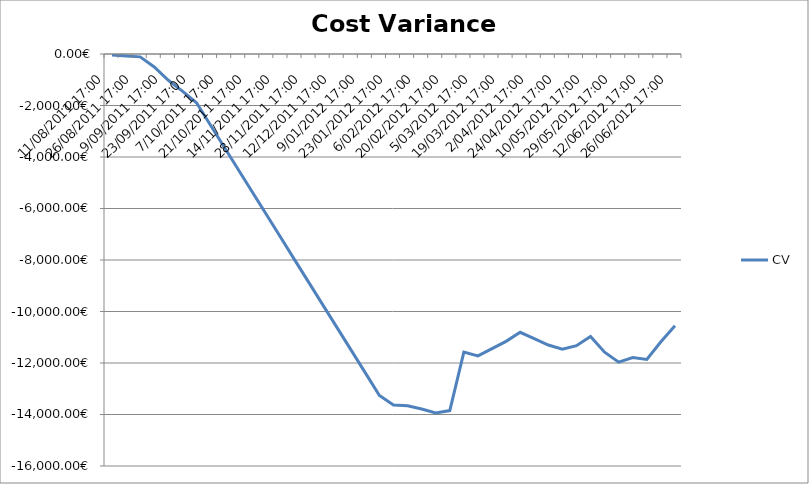
| Category | CV |
|---|---|
| 11/08/2011 17:00 | -36.951 |
| 19/08/2011 17:00 | -73.902 |
| 26/08/2011 17:00 | -110.853 |
| 2/09/2011 17:00 | -505.496 |
| 9/09/2011 17:00 | -1019.369 |
| 16/09/2011 17:00 | -1441.5 |
| 23/09/2011 17:00 | -1892.59 |
| 30/09/2011 17:00 | -2766.949 |
| 7/10/2011 17:00 | -3641.308 |
| 14/10/2011 17:00 | -4515.667 |
| 21/10/2011 17:00 | -5390.025 |
| 28/10/2011 17:00 | -6264.384 |
| 14/11/2011 17:00 | -7138.744 |
| 21/11/2011 17:00 | -8013.102 |
| 28/11/2011 17:00 | -8887.461 |
| 5/12/2011 17:00 | -9761.82 |
| 12/12/2011 17:00 | -10636.179 |
| 19/12/2011 17:00 | -11510.538 |
| 9/01/2012 17:00 | -12384.897 |
| 16/01/2012 17:00 | -13259.256 |
| 23/01/2012 17:00 | -13627.961 |
| 30/01/2012 17:00 | -13659.563 |
| 6/02/2012 17:00 | -13784.021 |
| 13/02/2012 17:00 | -13939.431 |
| 20/02/2012 17:00 | -13847.257 |
| 27/02/2012 17:00 | -11574.115 |
| 5/03/2012 17:00 | -11722.002 |
| 12/03/2012 17:00 | -11442.271 |
| 19/03/2012 17:00 | -11159.84 |
| 26/03/2012 17:00 | -10808.489 |
| 2/04/2012 17:00 | -11054.995 |
| 17/04/2012 17:00 | -11301.501 |
| 24/04/2012 17:00 | -11461.143 |
| 3/05/2012 17:00 | -11328.286 |
| 10/05/2012 17:00 | -10969.062 |
| 21/05/2012 17:00 | -11578.272 |
| 29/05/2012 17:00 | -11966.525 |
| 5/06/2012 17:00 | -11790.011 |
| 12/06/2012 17:00 | -11859.963 |
| 19/06/2012 17:00 | -11173.175 |
| 26/06/2012 17:00 | -10549.3 |